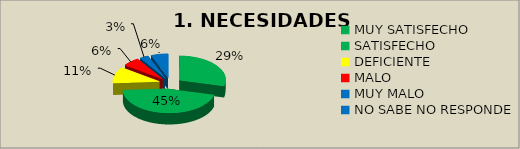
| Category | COMPONENTE 1: NECESIDADES BÁSICAS |
|---|---|
| MUY SATISFECHO | 0.29 |
| SATISFECHO | 0.45 |
| DEFICIENTE | 0.11 |
| MALO | 0.06 |
| MUY MALO | 0.03 |
| NO SABE NO RESPONDE | 0.06 |